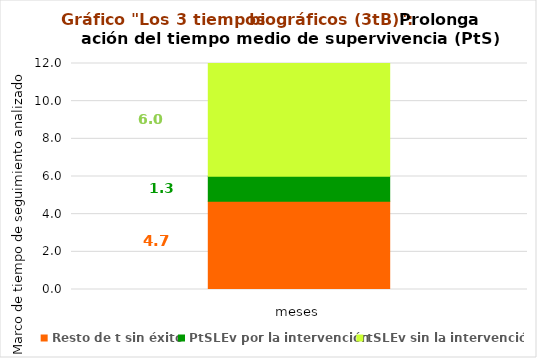
| Category | Resto de t sin éxito | PtSLEv por la intervención | tSLEv sin la intervención |
|---|---|---|---|
| 0 | 4.687 | 1.333 | 5.98 |